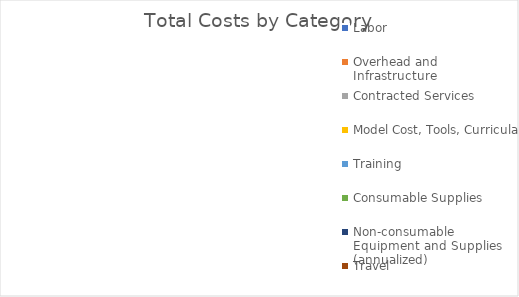
| Category | Series 0 |
|---|---|
| Labor | 0 |
| Overhead and Infrastructure | 0 |
| Contracted Services | 0 |
| Model Cost, Tools, Curricula | 0 |
| Training | 0 |
| Consumable Supplies | 0 |
| Non-consumable Equipment and Supplies (annualized) | 0 |
| Travel | 0 |